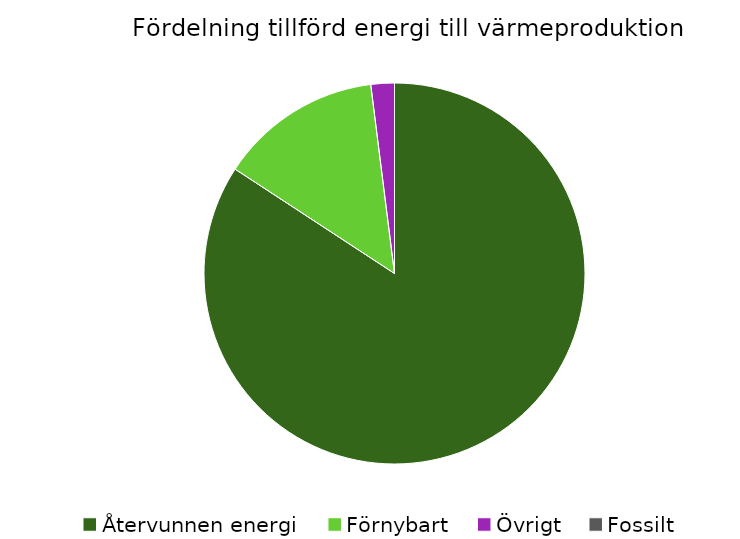
| Category | Fördelning värmeproduktion |
|---|---|
| Återvunnen energi | 0.842 |
| Förnybart | 0.138 |
| Övrigt | 0.02 |
| Fossilt | 0 |